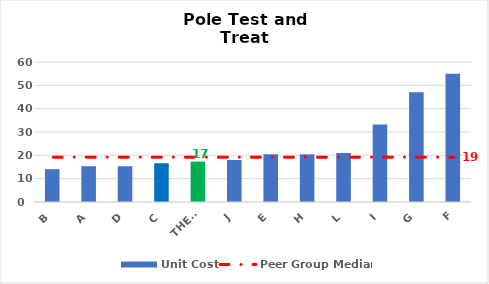
| Category | Unit Cost |
|---|---|
| B | 14.058 |
| A | 15.336 |
| D | 15.336 |
| C | 16.614 |
| THESL | 17.281 |
| J | 18 |
| E | 20.448 |
| H | 20.448 |
| L | 21 |
| I | 33.228 |
| G | 47 |
| F | 55 |